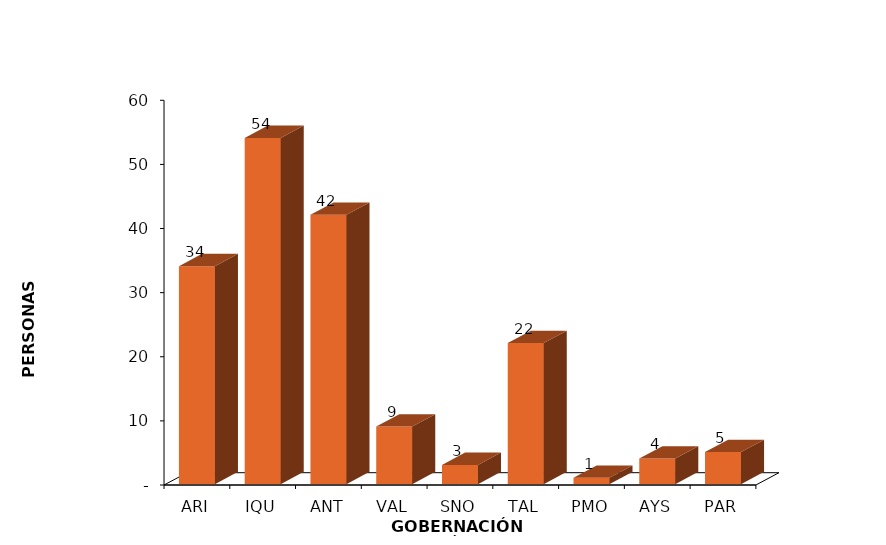
| Category | Series 0 |
|---|---|
| ARI | 34 |
| IQU | 54 |
| ANT | 42 |
| VAL | 9 |
| SNO | 3 |
| TAL | 22 |
| PMO | 1 |
| AYS | 4 |
| PAR | 5 |